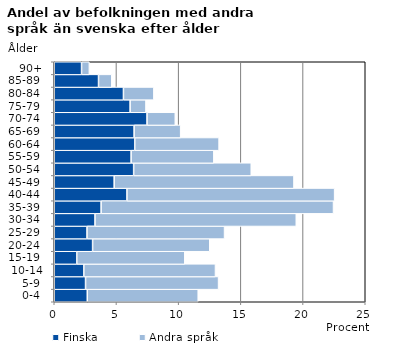
| Category | Finska | Andra språk |
|---|---|---|
|   0-4  | 2.655 | 8.918 |
|   5-9  | 2.516 | 10.692 |
| 10-14 | 2.377 | 10.583 |
| 15-19  | 1.811 | 8.682 |
| 20-24  | 3.083 | 9.417 |
| 25-29  | 2.635 | 11.054 |
| 30-34  | 3.276 | 16.179 |
| 35-39  | 3.768 | 18.681 |
| 40-44  | 5.845 | 16.693 |
| 45-49  | 4.817 | 14.452 |
| 50-54  | 6.382 | 9.453 |
| 55-59  | 6.179 | 6.651 |
| 60-64  | 6.47 | 6.781 |
| 65-69  | 6.421 | 3.741 |
| 70-74  | 7.459 | 2.27 |
| 75-79  | 6.099 | 1.273 |
| 80-84  | 5.562 | 2.447 |
| 85-89  | 3.559 | 1.068 |
| 90+ | 2.194 | 0.627 |